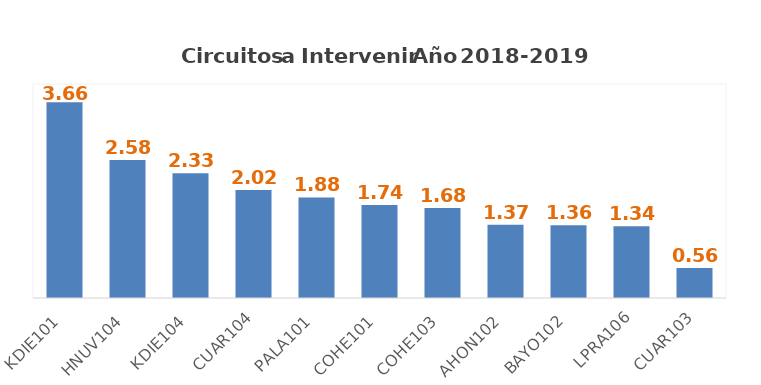
| Category | Series 0 |
|---|---|
| KDIE101 | 3.66 |
| HNUV104 | 2.58 |
| KDIE104 | 2.33 |
| CUAR104 | 2.02 |
| PALA101 | 1.88 |
| COHE101 | 1.74 |
| COHE103 | 1.68 |
| AHON102 | 1.37 |
| BAYO102 | 1.36 |
| LPRA106 | 1.34 |
| CUAR103 | 0.56 |